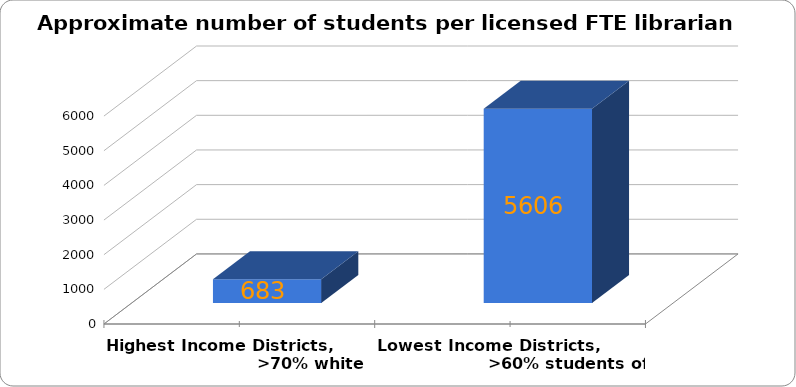
| Category | ~# of_x000d_FTE librarians to students |
|---|---|
| Highest Income Districts,                              >70% white | 683 |
| Lowest Income Districts,                           >60% students of color  | 5606 |